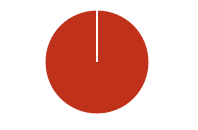
| Category | Total |
|---|---|
| Y | 0 |
| R | 0 |
| T | 0 |
| M | 0 |
| F | 0 |
| N | 95 |